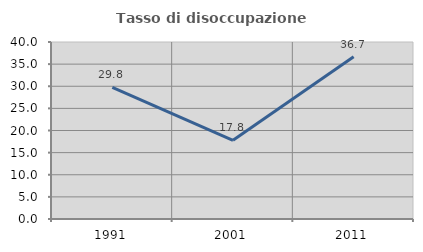
| Category | Tasso di disoccupazione giovanile  |
|---|---|
| 1991.0 | 29.762 |
| 2001.0 | 17.778 |
| 2011.0 | 36.667 |